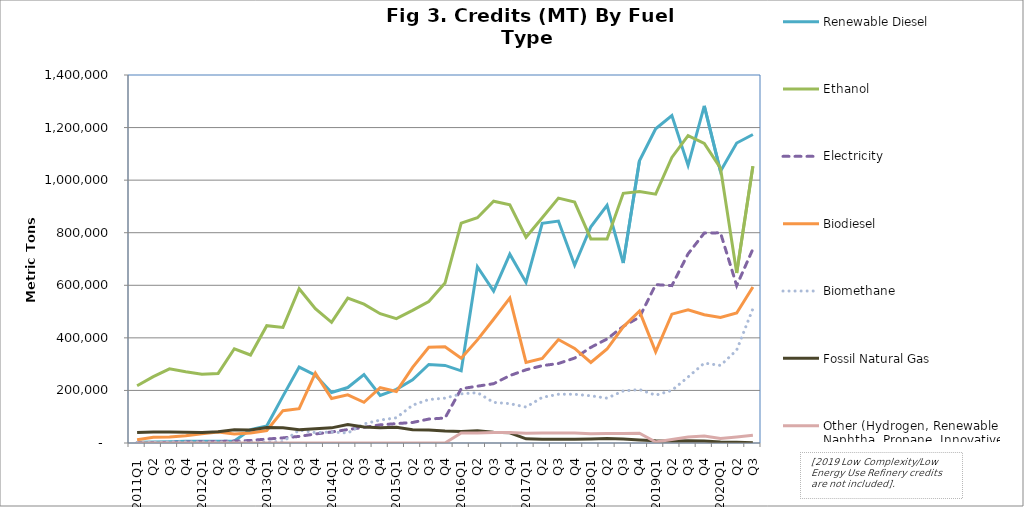
| Category | Renewable Diesel  | Ethanol | Electricity | Biodiesel | Biomethane | Fossil Natural Gas | Other (Hydrogen, Renewable Naphtha, Propane, Innovative Crude & Low Complexity / Low Energy Use Refining, etc.) |
|---|---|---|---|---|---|---|---|
| 2011Q1 | 3070 | 217913 | 459 | 12300 | 2212 | 39934 | 0 |
| Q2 | 3368 | 252550 | 1293 | 21555 | 3069 | 42169 | 0 |
| Q3 | 4362 | 282189 | 2455 | 22424 | 4960 | 41443 | 0 |
| Q4 | 6220 | 270901 | 3536 | 27988 | 4474 | 40844 | 0 |
| 2012Q1 | 6701 | 261269 | 4519 | 35382 | 4367 | 40226 | 0 |
| Q2 | 6804 | 264615 | 5560 | 41919 | 4221 | 43158 | 0 |
| Q3 | 7938 | 358459 | 7294 | 34052 | 3577 | 49942 | 0 |
| Q4 | 51216 | 334751 | 9611 | 37994 | 2680 | 49844 | 0 |
| 2013Q1 | 64445 | 446344 | 15051 | 47386 | 4240 | 59246 | 0 |
| Q2 | 178293 | 439633 | 19516 | 123072 | 5183 | 58045 | 0 |
| Q3 | 288998 | 586902 | 25039 | 130475 | 49133 | 50799 | 0 |
| Q4 | 258193 | 510999 | 34347 | 265737 | 39562 | 53765 | 0 |
| 2014Q1 | 192407 | 459238 | 41753 | 169218 | 41739 | 57641 | 0 |
| Q2 | 211004 | 551332 | 51092 | 183308 | 37894 | 70355 | 0 |
| Q3 | 260522 | 528433 | 59366 | 154934 | 72586 | 60793 | 0 |
| Q4 | 181046 | 491880 | 69119 | 210540 | 87339 | 58227 | 0 |
| 2015Q1 | 204352 | 473209 | 73708 | 195615 | 96047 | 59660 | 0 |
| Q2 | 240167 | 504542 | 78072 | 287973 | 143831 | 50678 | 0 |
| Q3 | 298591 | 538519 | 91036 | 364501 | 165388 | 49578 | 50 |
| Q4 | 295061 | 608484 | 94924 | 365821 | 170686 | 45675 | 24 |
| 2016Q1 | 274568 | 836629 | 206464 | 322607 | 186808 | 43627 | 37975 |
| Q2 | 670559 | 857168 | 216149 | 392318 | 191624 | 46616 | 38243 |
| Q3 | 577586 | 919750 | 225640 | 470922 | 154491 | 40957 | 39843 |
| Q4 | 718504 | 905839 | 256450 | 550936 | 149732 | 38991 | 39493 |
| 2017Q1 | 610652 | 783039 | 278442 | 306640 | 136721 | 16031 | 37028 |
| Q2 | 835625 | 856950 | 294201 | 321909 | 173497 | 14323 | 37617 |
| Q3 | 844159 | 931601 | 302457 | 393587 | 185321 | 14005 | 37717 |
| Q4 | 676294 | 916634 | 323014 | 359942 | 185446 | 14135 | 37644 |
| 2018Q1 | 822711 | 776336 | 363840 | 306337 | 179507 | 15292 | 35569 |
| Q2 | 904125 | 775942 | 395708 | 357508 | 170495 | 16964 | 36090 |
| Q3 | 684773 | 949941 | 443790 | 442007 | 197971 | 14909 | 36240 |
| Q4 | 1073782 | 956765 | 478635 | 501294 | 203315 | 11610 | 37400 |
| 2019Q1 | 1195556 | 946616 | 602432 | 347140 | 181925 | 8133 | 3903 |
| Q2 | 1245746 | 1086445 | 598746 | 490163 | 199923 | 7175 | 13318 |
| Q3 | 1056305 | 1169325 | 719616 | 506350 | 251078 | 8104 | 22802 |
| Q4 | 1282920 | 1139746 | 798731 | 488183 | 303885 | 7391 | 26633 |
| 2020Q1 | 1033524 | 1045825 | 799610 | 477186 | 294992 | 3785 | 16861 |
| Q2 | 1141261 | 646825 | 598875 | 494458 | 353395 | 2471 | 22585 |
| Q3 | 1173762 | 1052951 | 737880 | 593598 | 511122 | 1331 | 29663 |